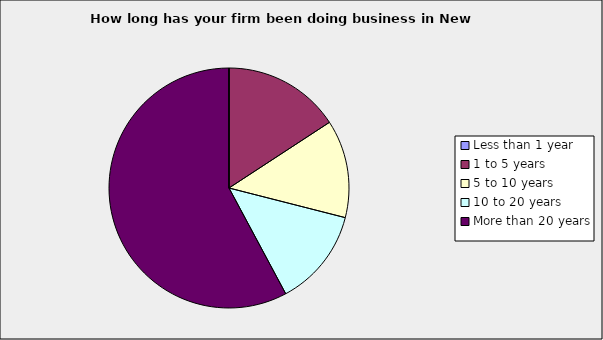
| Category | Series 0 |
|---|---|
| Less than 1 year | 0 |
| 1 to 5 years | 0.158 |
| 5 to 10 years | 0.132 |
| 10 to 20 years | 0.132 |
| More than 20 years | 0.579 |